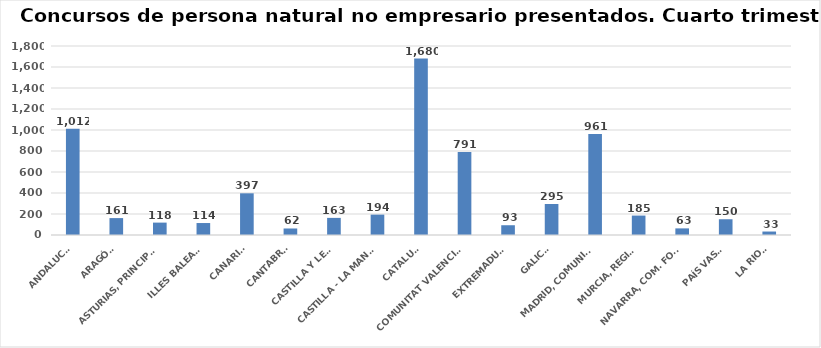
| Category | Series 0 |
|---|---|
| ANDALUCÍA | 1012 |
| ARAGÓN | 161 |
| ASTURIAS, PRINCIPADO | 118 |
| ILLES BALEARS | 114 |
| CANARIAS | 397 |
| CANTABRIA | 62 |
| CASTILLA Y LEÓN | 163 |
| CASTILLA - LA MANCHA | 194 |
| CATALUÑA | 1680 |
| COMUNITAT VALENCIANA | 791 |
| EXTREMADURA | 93 |
| GALICIA | 295 |
| MADRID, COMUNIDAD | 961 |
| MURCIA, REGIÓN | 185 |
| NAVARRA, COM. FORAL | 63 |
| PAÍS VASCO | 150 |
| LA RIOJA | 33 |